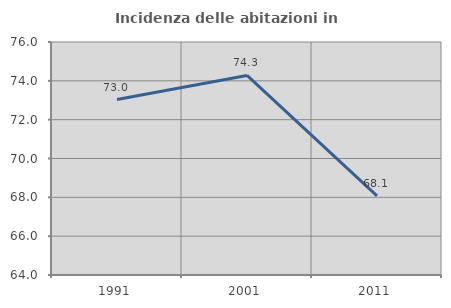
| Category | Incidenza delle abitazioni in proprietà  |
|---|---|
| 1991.0 | 73.034 |
| 2001.0 | 74.278 |
| 2011.0 | 68.074 |